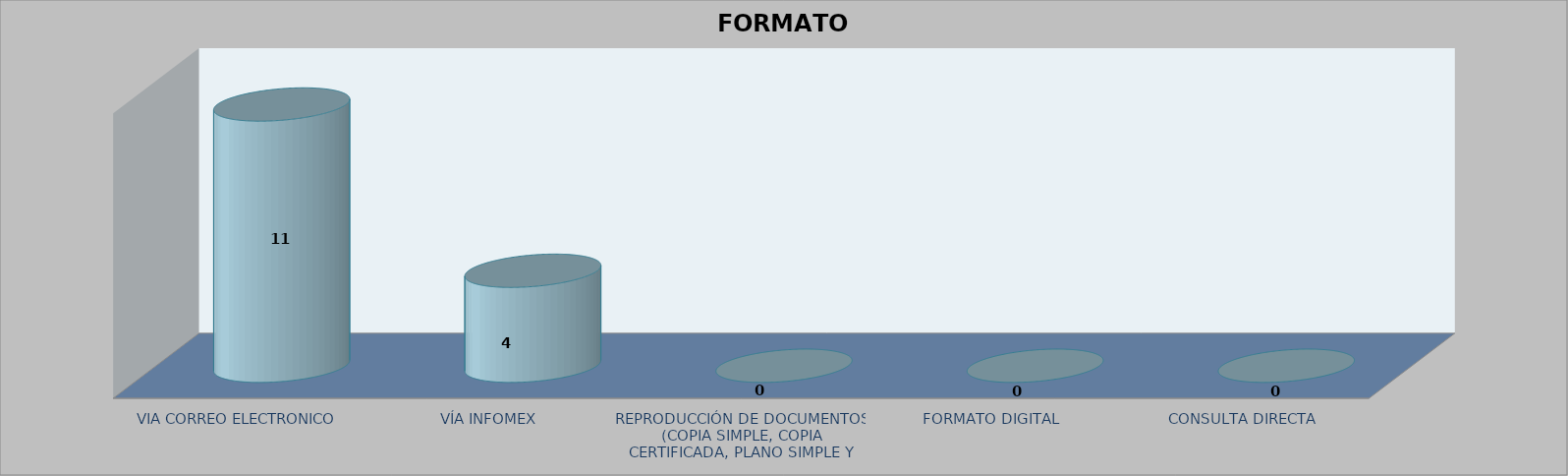
| Category |        FORMATO SOLICITADO | Series 1 | Series 2 |
|---|---|---|---|
| VIA CORREO ELECTRONICO |  |  | 11 |
| VÍA INFOMEX |  |  | 4 |
| REPRODUCCIÓN DE DOCUMENTOS (COPIA SIMPLE, COPIA CERTIFICADA, PLANO SIMPLE Y PLANO CERTIFICADO) |  |  | 0 |
| FORMATO DIGITAL |  |  | 0 |
| CONSULTA DIRECTA |  |  | 0 |